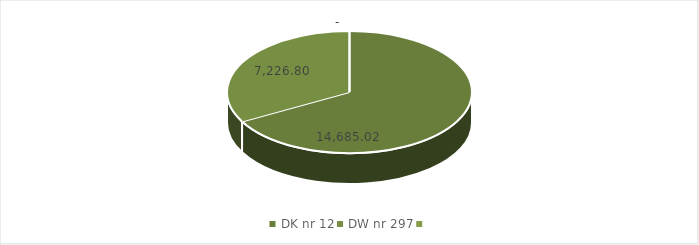
| Category | Series 1 | Series 2 | Series 0 |
|---|---|---|---|
| DK nr 12 | 14685.022 |  |  |
| DW nr 297 | 7226.799 |  |  |